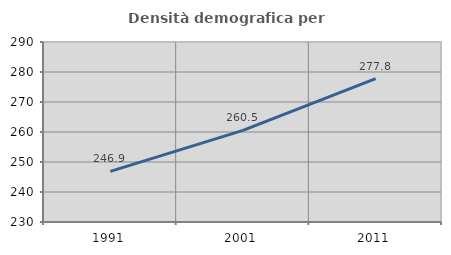
| Category | Densità demografica |
|---|---|
| 1991.0 | 246.876 |
| 2001.0 | 260.527 |
| 2011.0 | 277.805 |